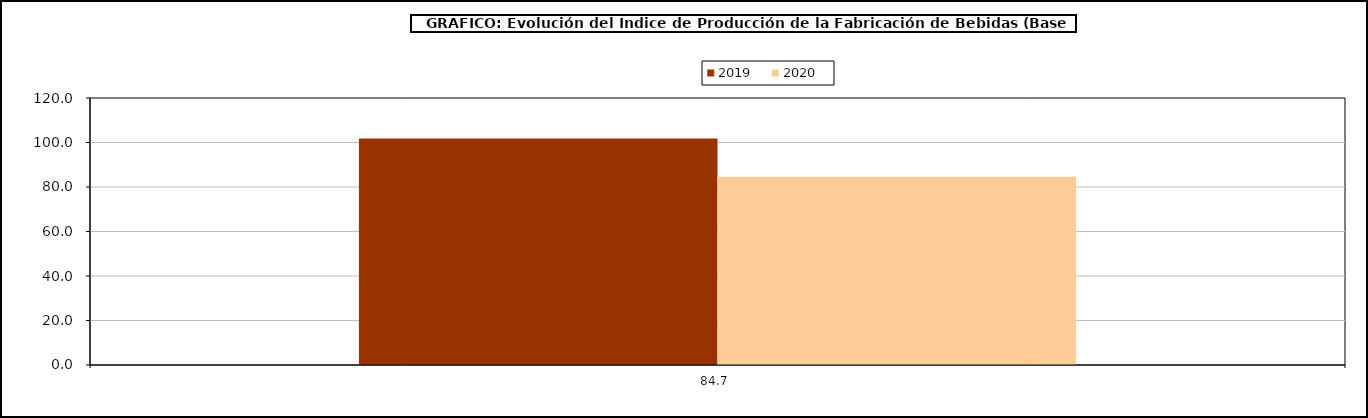
| Category | 2019 | 2020 |
|---|---|---|
| 84.65833333333333 | 101.821 | 84.658 |